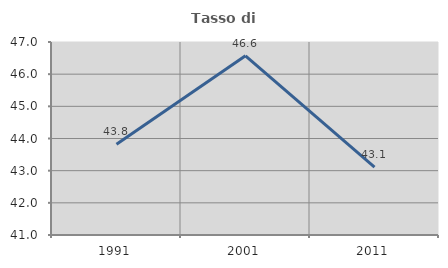
| Category | Tasso di occupazione   |
|---|---|
| 1991.0 | 43.819 |
| 2001.0 | 46.571 |
| 2011.0 | 43.109 |